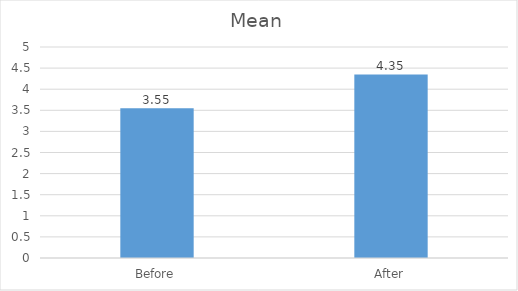
| Category | Mean |
|---|---|
| Before | 3.55 |
| After | 4.35 |